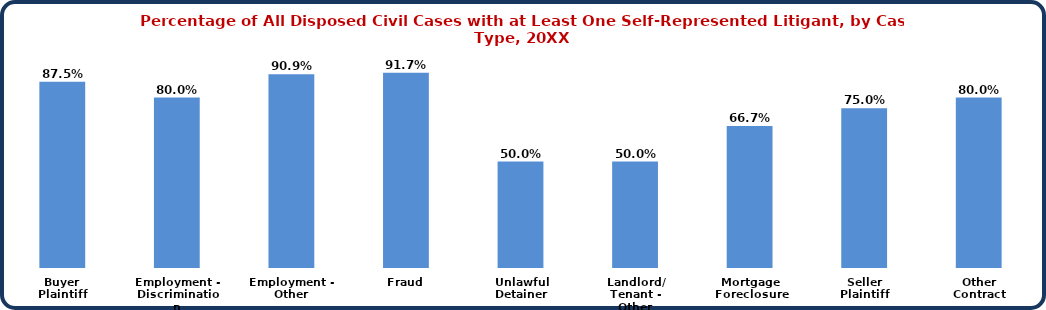
| Category | Series 0 |
|---|---|
| Buyer
Plaintiff | 0.875 |
| Employment -
Discrimination | 0.8 |
| Employment -
Other | 0.909 |
| Fraud | 0.917 |
| Unlawful
Detainer | 0.5 |
| Landlord/
Tenant - Other | 0.5 |
| Mortgage
Foreclosure | 0.667 |
| Seller
Plaintiff | 0.75 |
| Other
Contract | 0.8 |